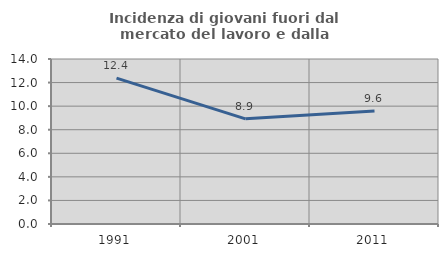
| Category | Incidenza di giovani fuori dal mercato del lavoro e dalla formazione  |
|---|---|
| 1991.0 | 12.381 |
| 2001.0 | 8.923 |
| 2011.0 | 9.579 |